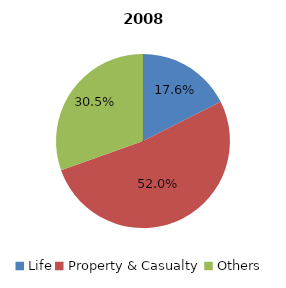
| Category | 2008 |
|---|---|
| Life | 169520337 |
| Property & Casualty | 501796168 |
| Others | 294102063 |